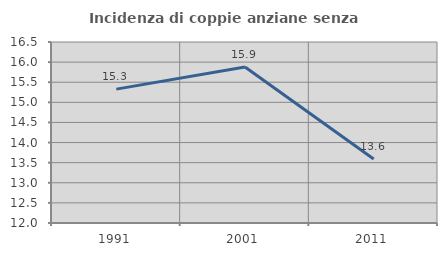
| Category | Incidenza di coppie anziane senza figli  |
|---|---|
| 1991.0 | 15.328 |
| 2001.0 | 15.88 |
| 2011.0 | 13.59 |